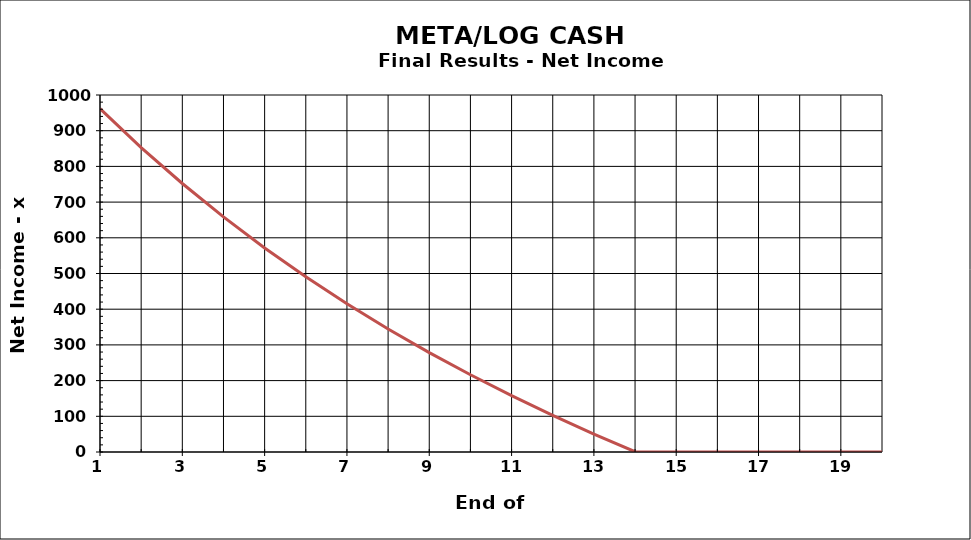
| Category | Series 1 |
|---|---|
| 1.0 | 961.591 |
| 2.0 | 852.884 |
| 3.0 | 752.123 |
| 4.0 | 658.597 |
| 5.0 | 571.655 |
| 6.0 | 490.698 |
| 7.0 | 415.175 |
| 8.0 | 344.579 |
| 9.0 | 278.443 |
| 10.0 | 216.338 |
| 11.0 | 157.866 |
| 12.0 | 102.662 |
| 13.0 | 50.388 |
| 14.0 | 0.733 |
| 15.0 | 0 |
| 16.0 | 0 |
| 17.0 | 0 |
| 18.0 | 0 |
| 19.0 | 0 |
| 20.0 | 0 |